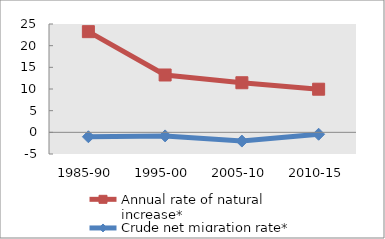
| Category | Annual rate of natural increase* | Crude net migration rate* |
|---|---|---|
| 1985-90 | 23.233 | -1.018 |
| 1995-00 | 13.234 | -0.824 |
| 2005-10 | 11.443 | -2.018 |
| 2010-15 | 9.953 | -0.439 |